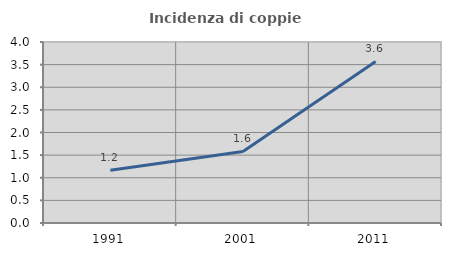
| Category | Incidenza di coppie miste |
|---|---|
| 1991.0 | 1.166 |
| 2001.0 | 1.582 |
| 2011.0 | 3.571 |